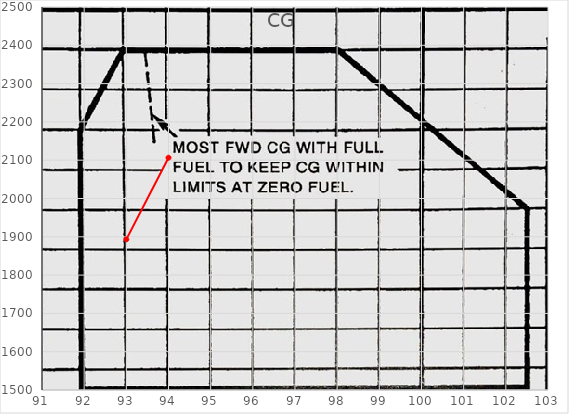
| Category | CG |
|---|---|
| 94.0 | 2106.5 |
| 93.0 | 1893.3 |